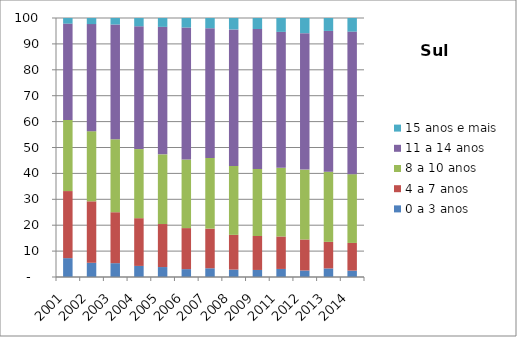
| Category | 0 a 3 anos | 4 a 7 anos | 8 a 10 anos | 11 a 14 anos | 15 anos e mais |
|---|---|---|---|---|---|
| 2001.0 | 7.28 | 25.9 | 27.47 | 37.18 | 2.18 |
| 2002.0 | 5.49 | 23.73 | 27.07 | 41.35 | 2.35 |
| 2003.0 | 5.34 | 19.67 | 28.17 | 44.31 | 2.52 |
| 2004.0 | 4.28 | 18.43 | 26.68 | 47.41 | 3.2 |
| 2005.0 | 3.84 | 16.61 | 26.9 | 49.23 | 3.41 |
| 2006.0 | 3.04 | 15.84 | 26.49 | 50.95 | 3.68 |
| 2007.0 | 3.37 | 15.31 | 27.26 | 50.11 | 3.95 |
| 2008.0 | 2.87 | 13.4 | 26.58 | 52.74 | 4.41 |
| 2009.0 | 2.72 | 13.11 | 25.88 | 54.04 | 4.25 |
| 2011.0 | 3.11 | 12.53 | 26.5 | 52.51 | 5.35 |
| 2012.0 | 2.51 | 11.98 | 26.98 | 52.67 | 5.86 |
| 2013.0 | 3.31 | 10.26 | 27.07 | 54.37 | 4.99 |
| 2014.0 | 2.47 | 10.68 | 26.55 | 55.05 | 5.24 |